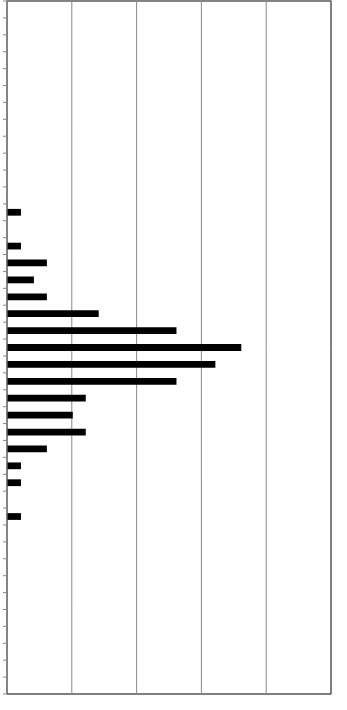
| Category | Series 0 |
|---|---|
| 0 | 0 |
| 1 | 0 |
| 2 | 0 |
| 3 | 0 |
| 4 | 0 |
| 5 | 0 |
| 6 | 0 |
| 7 | 0 |
| 8 | 0 |
| 9 | 0 |
| 10 | 0 |
| 11 | 0 |
| 12 | 1 |
| 13 | 0 |
| 14 | 1 |
| 15 | 3 |
| 16 | 2 |
| 17 | 3 |
| 18 | 7 |
| 19 | 13 |
| 20 | 18 |
| 21 | 16 |
| 22 | 13 |
| 23 | 6 |
| 24 | 5 |
| 25 | 6 |
| 26 | 3 |
| 27 | 1 |
| 28 | 1 |
| 29 | 0 |
| 30 | 1 |
| 31 | 0 |
| 32 | 0 |
| 33 | 0 |
| 34 | 0 |
| 35 | 0 |
| 36 | 0 |
| 37 | 0 |
| 38 | 0 |
| 39 | 0 |
| 40 | 0 |